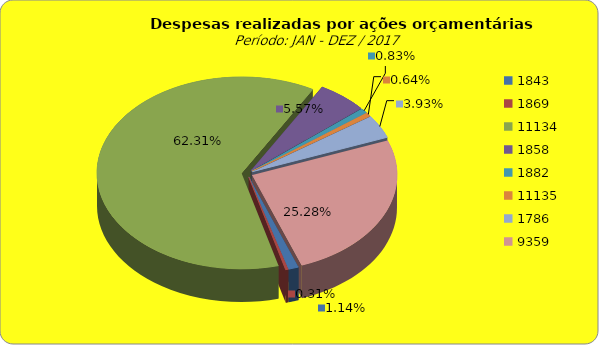
| Category | Series 1 |
|---|---|
| 1843.0 | 2980061.11 |
| 1869.0 | 807712.5 |
| 11134.0 | 163562168.39 |
| 1858.0 | 14624420.14 |
| 1882.0 | 2186813.63 |
| 11135.0 | 1672826.77 |
| 1786.0 | 10310552.3 |
| 9359.0 | 66369429.6 |